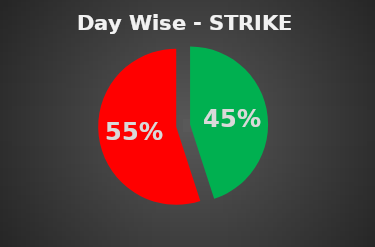
| Category | Series 0 |
|---|---|
| 0 | 0.45 |
| 1 | 0.55 |